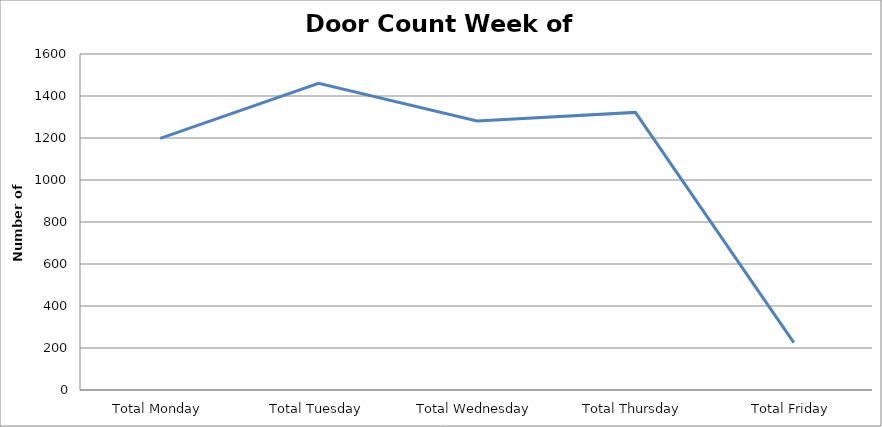
| Category | Series 0 |
|---|---|
| Total Monday | 1198.5 |
| Total Tuesday | 1460 |
| Total Wednesday | 1281 |
| Total Thursday | 1322 |
| Total Friday | 226 |